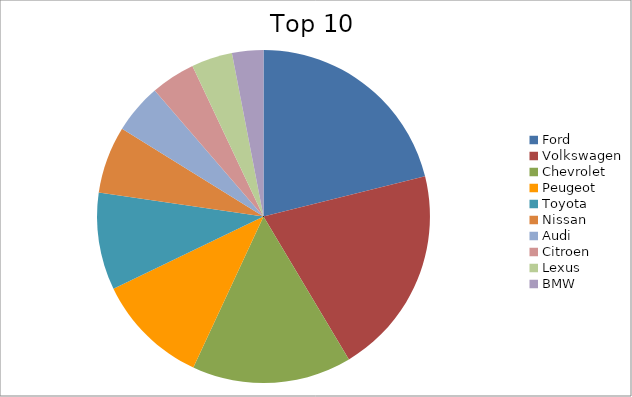
| Category | Series 0 |
|---|---|
| Ford | 21.12 |
| Volkswagen | 20.31 |
| Chevrolet | 15.5 |
| Peugeot | 10.94 |
| Toyota | 9.45 |
| Nissan | 6.53 |
| Audi | 4.83 |
| Citroen | 4.31 |
| Lexus | 3.98 |
| BMW | 3.04 |